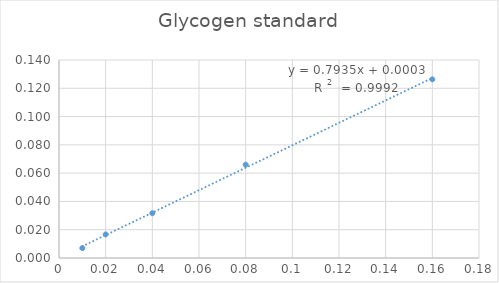
| Category | Series 0 |
|---|---|
| 0.01 | 0.007 |
| 0.02 | 0.017 |
| 0.04 | 0.032 |
| 0.08 | 0.066 |
| 0.16 | 0.126 |